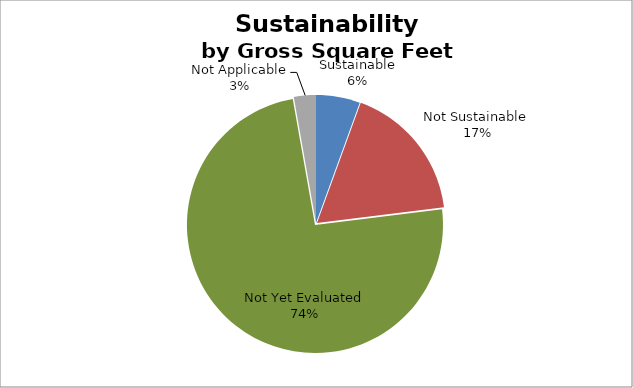
| Category | Series 0 |
|---|---|
| Sustainable | 136025370.02 |
| Not Sustainable  | 428307980.82 |
| Not Yet Evaluated | 1817737689.171 |
| Not Applicable | 68099848 |